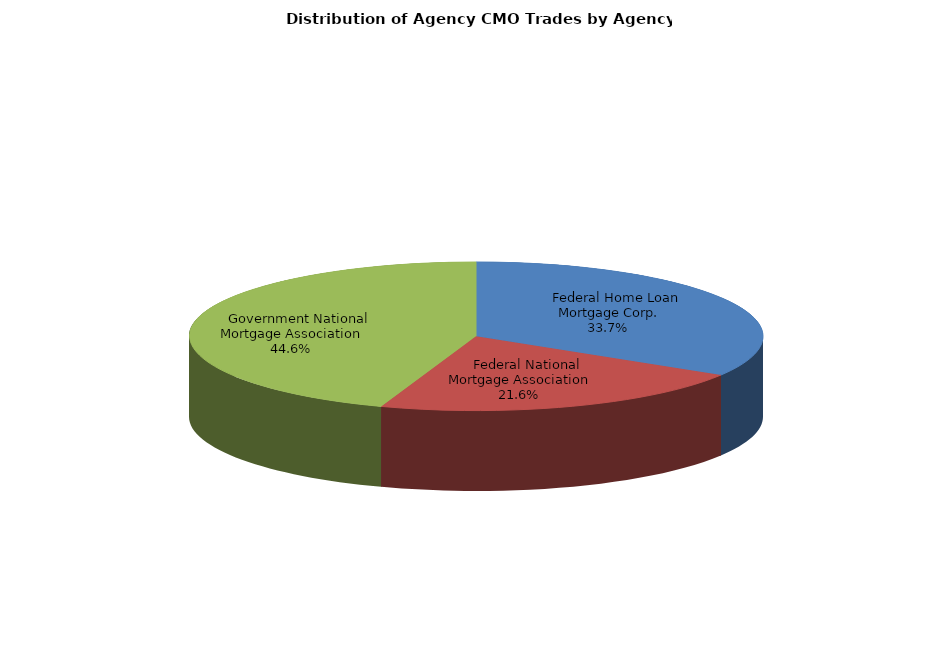
| Category | Series 0 |
|---|---|
|     Federal Home Loan Mortgage Corp. | 250.164 |
|     Federal National Mortgage Association | 160.372 |
|     Government National Mortgage Association | 331.084 |